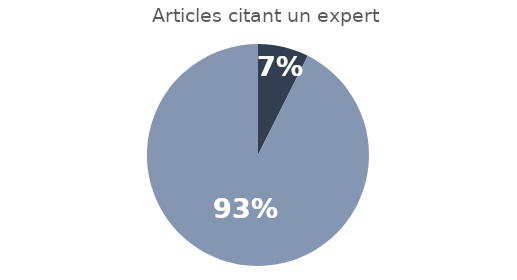
| Category | Series 0 |
|---|---|
| 0 | 0.074 |
| 1 | 0.926 |